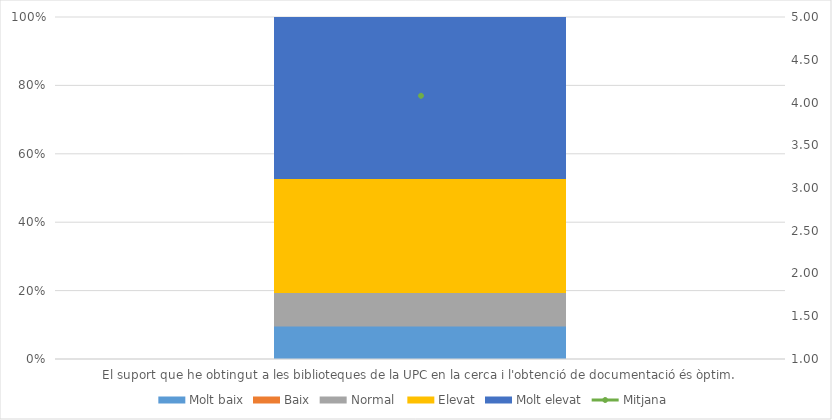
| Category | Molt baix | Baix | Normal  | Elevat | Molt elevat |
|---|---|---|---|---|---|
| El suport que he obtingut a les biblioteques de la UPC en la cerca i l'obtenció de documentació és òptim. | 5 | 0 | 5 | 17 | 24 |